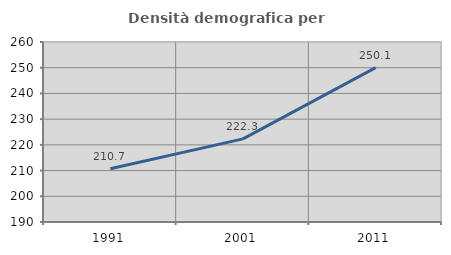
| Category | Densità demografica |
|---|---|
| 1991.0 | 210.727 |
| 2001.0 | 222.315 |
| 2011.0 | 250.051 |